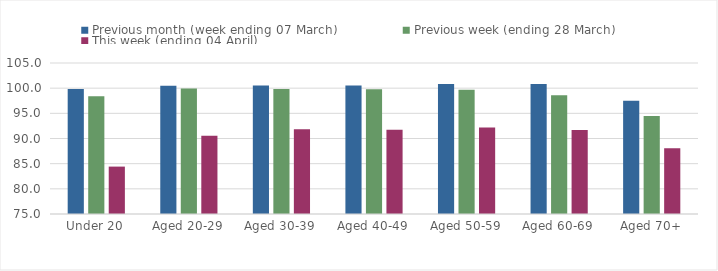
| Category | Previous month (week ending 07 March) | Previous week (ending 28 March) | This week (ending 04 April) |
|---|---|---|---|
| Under 20 | 99.849 | 98.411 | 84.418 |
| Aged 20-29 | 100.463 | 99.909 | 90.569 |
| Aged 30-39 | 100.521 | 99.832 | 91.859 |
| Aged 40-49 | 100.526 | 99.806 | 91.72 |
| Aged 50-59 | 100.843 | 99.706 | 92.169 |
| Aged 60-69 | 100.836 | 98.589 | 91.67 |
| Aged 70+ | 97.485 | 94.467 | 88.066 |